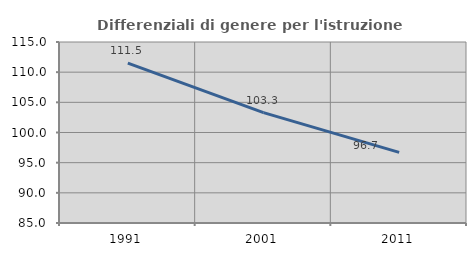
| Category | Differenziali di genere per l'istruzione superiore |
|---|---|
| 1991.0 | 111.503 |
| 2001.0 | 103.291 |
| 2011.0 | 96.709 |